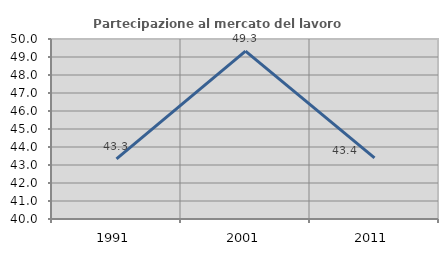
| Category | Partecipazione al mercato del lavoro  femminile |
|---|---|
| 1991.0 | 43.34 |
| 2001.0 | 49.331 |
| 2011.0 | 43.396 |